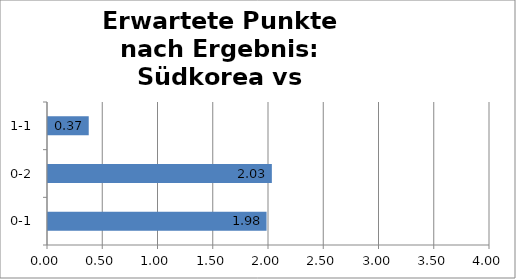
| Category | Series 0 |
|---|---|
| 0-1 | 1.978 |
| 0-2 | 2.026 |
| 1-1 | 0.369 |